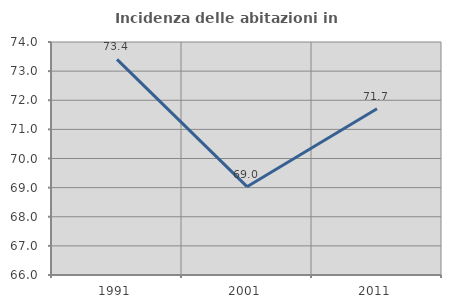
| Category | Incidenza delle abitazioni in proprietà  |
|---|---|
| 1991.0 | 73.404 |
| 2001.0 | 69.032 |
| 2011.0 | 71.711 |